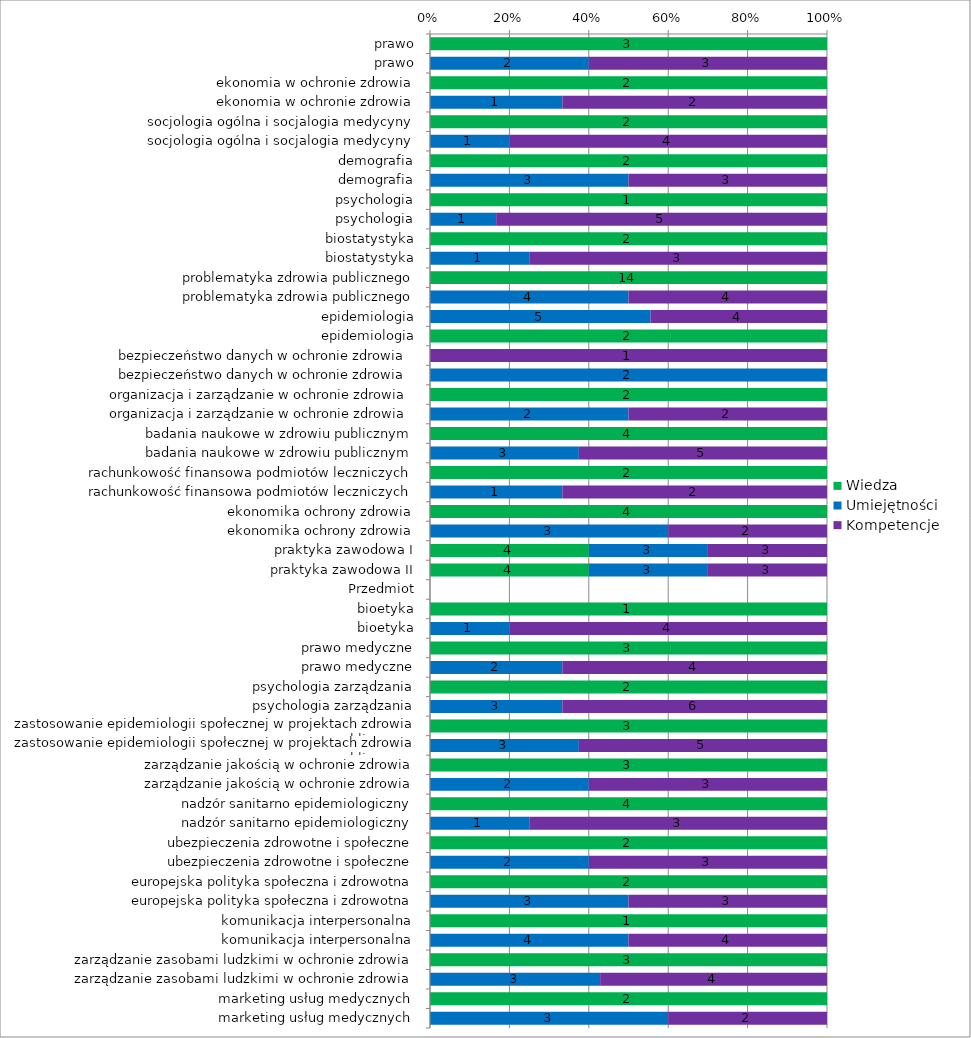
| Category | Wiedza | Umiejętności | Kompetencje |
|---|---|---|---|
|  prawo | 3 | 0 | 0 |
|  prawo | 0 | 2 | 3 |
|  ekonomia w ochronie zdrowia | 2 | 0 | 0 |
|  ekonomia w ochronie zdrowia | 0 | 1 | 2 |
|  socjologia ogólna i socjalogia medycyny | 2 | 0 | 0 |
|  socjologia ogólna i socjalogia medycyny | 0 | 1 | 4 |
|  demografia | 2 | 0 | 0 |
|  demografia | 0 | 3 | 3 |
|  psychologia | 1 | 0 | 0 |
|  psychologia | 0 | 1 | 5 |
|  biostatystyka | 2 | 0 | 0 |
|  biostatystyka | 0 | 1 | 3 |
| problematyka zdrowia publicznego | 14 | 0 | 0 |
| problematyka zdrowia publicznego | 0 | 4 | 4 |
| epidemiologia | 0 | 5 | 4 |
| epidemiologia | 2 | 0 | 0 |
| bezpieczeństwo danych w ochronie zdrowia  | 0 | 0 | 1 |
| bezpieczeństwo danych w ochronie zdrowia  | 0 | 2 | 0 |
| organizacja i zarządzanie w ochronie zdrowia  | 2 | 0 | 0 |
| organizacja i zarządzanie w ochronie zdrowia  | 0 | 2 | 2 |
| badania naukowe w zdrowiu publicznym | 4 | 0 | 0 |
| badania naukowe w zdrowiu publicznym | 0 | 3 | 5 |
| rachunkowość finansowa podmiotów leczniczych | 2 | 0 | 0 |
| rachunkowość finansowa podmiotów leczniczych | 0 | 1 | 2 |
| ekonomika ochrony zdrowia | 4 | 0 | 0 |
| ekonomika ochrony zdrowia | 0 | 3 | 2 |
| praktyka zawodowa I | 4 | 3 | 3 |
| praktyka zawodowa II | 4 | 3 | 3 |
| Przedmiot | 0 | 0 | 0 |
| bioetyka | 1 | 0 | 0 |
| bioetyka | 0 | 1 | 4 |
| prawo medyczne | 3 | 0 | 0 |
| prawo medyczne | 0 | 2 | 4 |
| psychologia zarządzania | 2 | 0 | 0 |
| psychologia zarządzania | 0 | 3 | 6 |
| zastosowanie epidemiologii społecznej w projektach zdrowia publicznego  | 3 | 0 | 0 |
| zastosowanie epidemiologii społecznej w projektach zdrowia publicznego  | 0 | 3 | 5 |
| zarządzanie jakością w ochronie zdrowia | 3 | 0 | 0 |
| zarządzanie jakością w ochronie zdrowia | 0 | 2 | 3 |
| nadzór sanitarno epidemiologiczny | 4 | 0 | 0 |
| nadzór sanitarno epidemiologiczny | 0 | 1 | 3 |
| ubezpieczenia zdrowotne i społeczne | 2 | 0 | 0 |
| ubezpieczenia zdrowotne i społeczne | 0 | 2 | 3 |
| europejska polityka społeczna i zdrowotna | 2 | 0 | 0 |
| europejska polityka społeczna i zdrowotna | 0 | 3 | 3 |
| komunikacja interpersonalna | 1 | 0 | 0 |
| komunikacja interpersonalna | 0 | 4 | 4 |
| zarządzanie zasobami ludzkimi w ochronie zdrowia | 3 | 0 | 0 |
| zarządzanie zasobami ludzkimi w ochronie zdrowia | 0 | 3 | 4 |
| marketing usług medycznych | 2 | 0 | 0 |
| marketing usług medycznych | 0 | 3 | 2 |